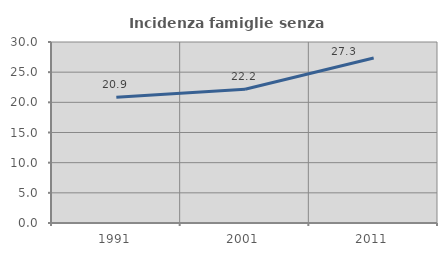
| Category | Incidenza famiglie senza nuclei |
|---|---|
| 1991.0 | 20.861 |
| 2001.0 | 22.159 |
| 2011.0 | 27.335 |